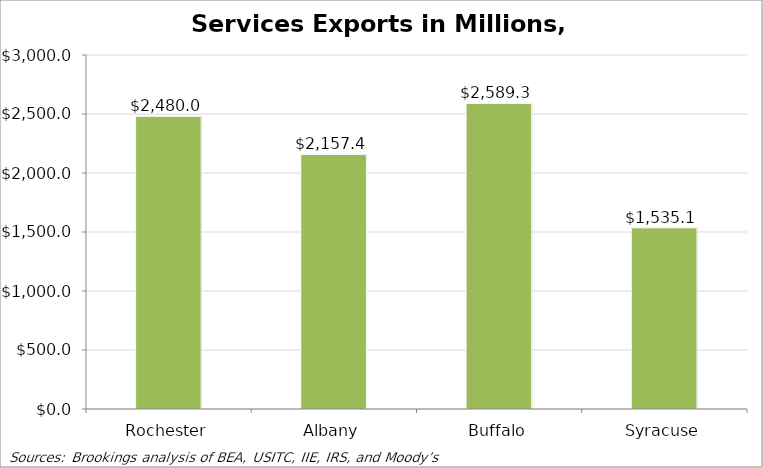
| Category | Services exports, 2009 (millions) |
|---|---|
| Rochester | 2480.001 |
| Albany | 2157.386 |
| Buffalo | 2589.292 |
| Syracuse | 1535.129 |